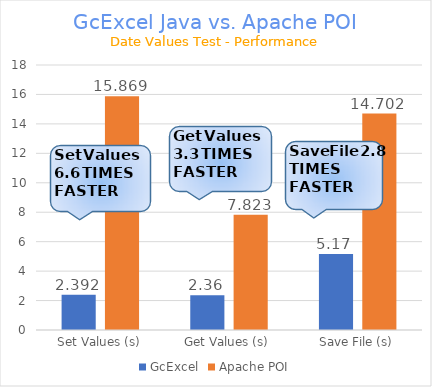
| Category | GcExcel | Apache POI |
|---|---|---|
| Set Values (s) | 2.392 | 15.869 |
| Get Values (s) | 2.36 | 7.823 |
| Save File (s) | 5.17 | 14.702 |